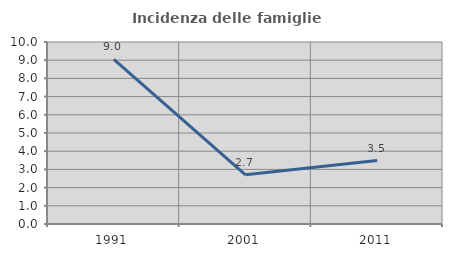
| Category | Incidenza delle famiglie numerose |
|---|---|
| 1991.0 | 9.044 |
| 2001.0 | 2.7 |
| 2011.0 | 3.488 |